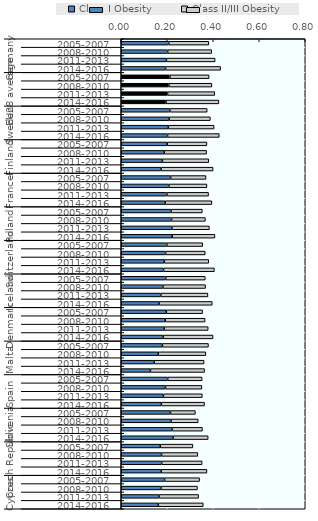
| Category | Class I Obesity | Class II/III Obesity |
|---|---|---|
| 0 | 0.206 | 0.174 |
| 1 | 0.202 | 0.192 |
| 2 | 0.196 | 0.212 |
| 3 | 0.193 | 0.239 |
| 4 | 0.211 | 0.171 |
| 5 | 0.207 | 0.187 |
| 6 | 0.201 | 0.205 |
| 7 | 0.195 | 0.23 |
| 8 | 0.211 | 0.162 |
| 9 | 0.208 | 0.179 |
| 10 | 0.205 | 0.199 |
| 11 | 0.201 | 0.225 |
| 12 | 0.2 | 0.172 |
| 13 | 0.187 | 0.184 |
| 14 | 0.179 | 0.202 |
| 15 | 0.173 | 0.226 |
| 16 | 0.215 | 0.154 |
| 17 | 0.207 | 0.165 |
| 18 | 0.198 | 0.181 |
| 19 | 0.191 | 0.203 |
| 20 | 0.216 | 0.136 |
| 21 | 0.219 | 0.147 |
| 22 | 0.22 | 0.163 |
| 23 | 0.222 | 0.186 |
| 24 | 0.198 | 0.156 |
| 25 | 0.193 | 0.172 |
| 26 | 0.187 | 0.193 |
| 27 | 0.184 | 0.221 |
| 28 | 0.193 | 0.172 |
| 29 | 0.181 | 0.185 |
| 30 | 0.172 | 0.205 |
| 31 | 0.164 | 0.231 |
| 32 | 0.196 | 0.158 |
| 33 | 0.191 | 0.173 |
| 34 | 0.187 | 0.191 |
| 35 | 0.182 | 0.217 |
| 36 | 0.179 | 0.2 |
| 37 | 0.161 | 0.207 |
| 38 | 0.143 | 0.217 |
| 39 | 0.127 | 0.235 |
| 40 | 0.202 | 0.15 |
| 41 | 0.192 | 0.158 |
| 42 | 0.183 | 0.169 |
| 43 | 0.175 | 0.188 |
| 44 | 0.214 | 0.108 |
| 45 | 0.217 | 0.118 |
| 46 | 0.221 | 0.132 |
| 47 | 0.225 | 0.152 |
| 48 | 0.17 | 0.142 |
| 49 | 0.175 | 0.158 |
| 50 | 0.176 | 0.176 |
| 51 | 0.174 | 0.199 |
| 52 | 0.188 | 0.152 |
| 53 | 0.173 | 0.158 |
| 54 | 0.164 | 0.172 |
| 55 | 0.161 | 0.196 |